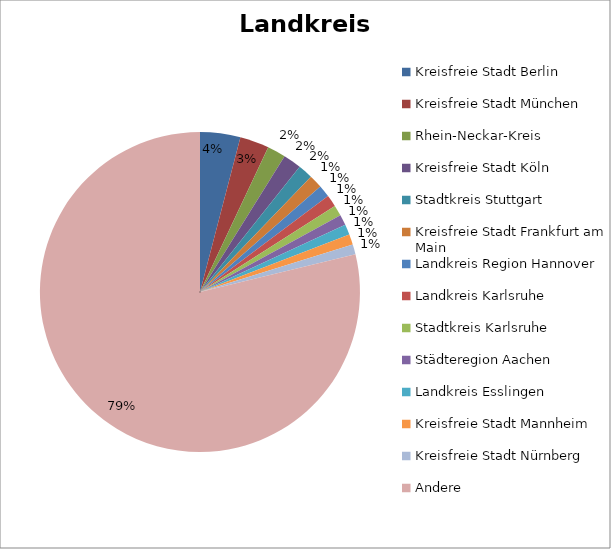
| Category | Series 0 |
|---|---|
| Kreisfreie Stadt Berlin | 689 |
| Kreisfreie Stadt München | 499 |
| Rhein-Neckar-Kreis | 314 |
| Kreisfreie Stadt Köln | 311 |
| Stadtkreis Stuttgart | 252 |
| Kreisfreie Stadt Frankfurt am Main | 230 |
| Landkreis Region Hannover | 206 |
| Landkreis Karlsruhe | 202 |
| Stadtkreis Karlsruhe | 184 |
| Städteregion Aachen | 181 |
| Landkreis Esslingen | 177 |
| Kreisfreie Stadt Mannheim | 176 |
| Kreisfreie Stadt Nürnberg | 171 |
| Andere | 13350 |